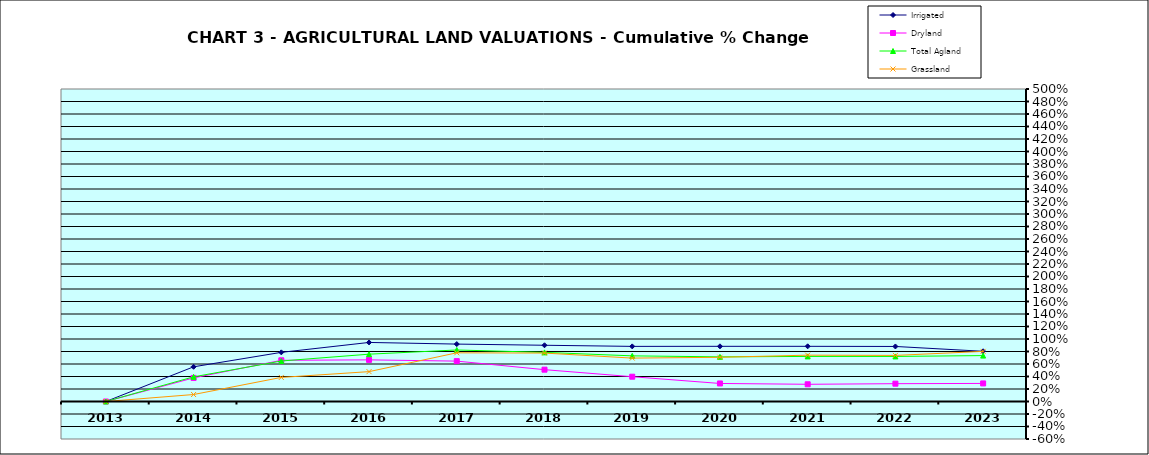
| Category | Irrigated | Dryland | Total Agland | Grassland |
|---|---|---|---|---|
| 2013.0 | 0 | 0 | 0 | 0 |
| 2014.0 | 0.555 | 0.378 | 0.395 | 0.112 |
| 2015.0 | 0.786 | 0.659 | 0.648 | 0.385 |
| 2016.0 | 0.945 | 0.666 | 0.757 | 0.478 |
| 2017.0 | 0.919 | 0.646 | 0.824 | 0.779 |
| 2018.0 | 0.9 | 0.509 | 0.786 | 0.775 |
| 2019.0 | 0.882 | 0.397 | 0.73 | 0.694 |
| 2020.0 | 0.883 | 0.289 | 0.714 | 0.707 |
| 2021.0 | 0.883 | 0.275 | 0.721 | 0.741 |
| 2022.0 | 0.881 | 0.285 | 0.721 | 0.737 |
| 2023.0 | 0.803 | 0.289 | 0.735 | 0.802 |